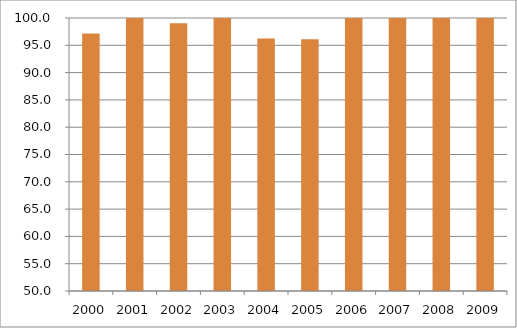
| Category | Região Nordeste |
|---|---|
| 2000.0 | 97.15 |
| 2001.0 | 103.72 |
| 2002.0 | 99.05 |
| 2003.0 | 99.99 |
| 2004.0 | 96.24 |
| 2005.0 | 96.09 |
| 2006.0 | 105.96 |
| 2007.0 | 108.31 |
| 2008.0 | 102.35 |
| 2009.0 | 103.04 |